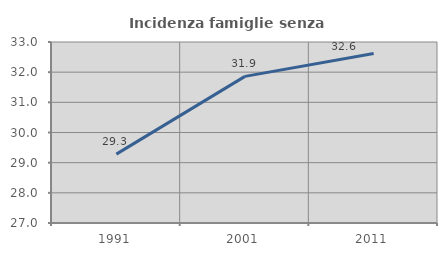
| Category | Incidenza famiglie senza nuclei |
|---|---|
| 1991.0 | 29.284 |
| 2001.0 | 31.861 |
| 2011.0 | 32.62 |